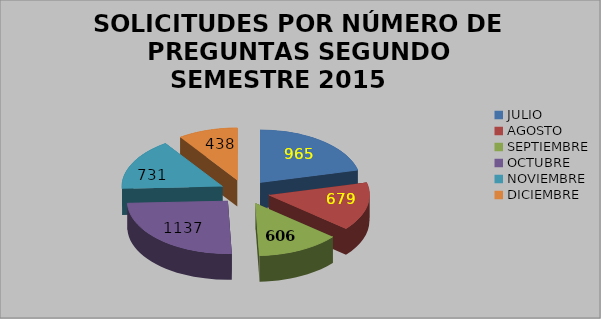
| Category | SOLICITUDES POR NÚMERO DE PREGUNTAS SEGUNDO SEMESTRE 2015 |
|---|---|
| JULIO | 965 |
| AGOSTO | 679 |
| SEPTIEMBRE | 606 |
| OCTUBRE | 1137 |
| NOVIEMBRE | 731 |
| DICIEMBRE | 438 |